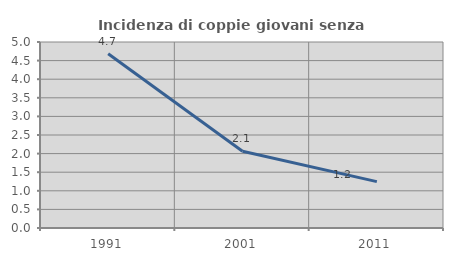
| Category | Incidenza di coppie giovani senza figli |
|---|---|
| 1991.0 | 4.683 |
| 2001.0 | 2.065 |
| 2011.0 | 1.246 |